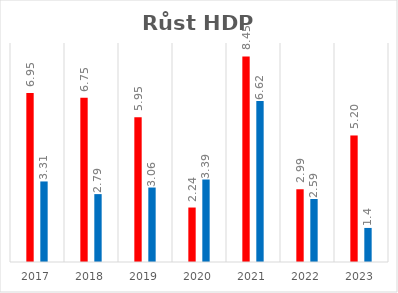
| Category | Růst HDP(%) CHN | Růst HDP(%) TAIW |
|---|---|---|
| 2017.0 | 6.947 | 3.31 |
| 2018.0 | 6.75 | 2.79 |
| 2019.0 | 5.951 | 3.06 |
| 2020.0 | 2.239 | 3.39 |
| 2021.0 | 8.448 | 6.62 |
| 2022.0 | 2.989 | 2.59 |
| 2023.0 | 5.2 | 1.4 |